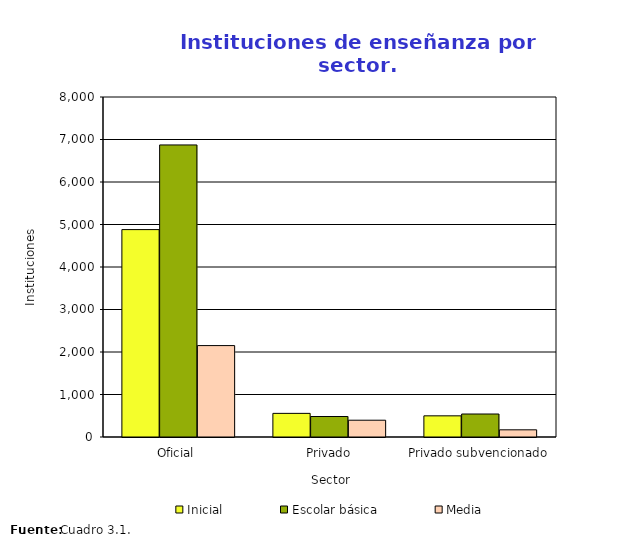
| Category | Inicial | Escolar básica | Media |
|---|---|---|---|
| Oficial | 4880 | 6872 | 2151 |
| Privado | 556 | 482 | 395 |
| Privado subvencionado | 498 | 541 | 169 |